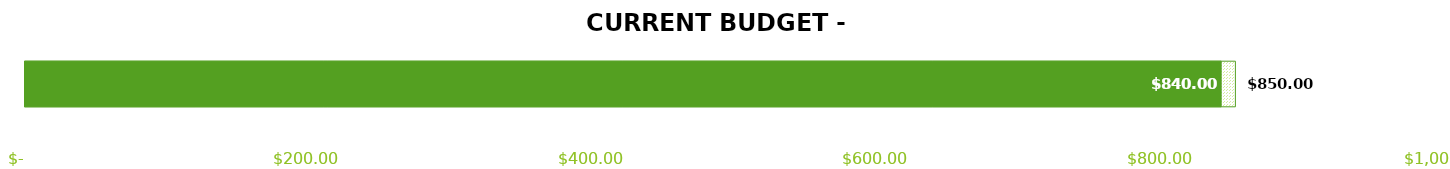
| Category | Series 1 |
|---|---|
| BUDGET | 850 |